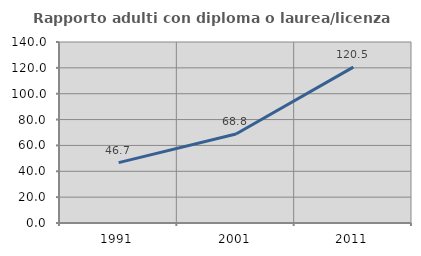
| Category | Rapporto adulti con diploma o laurea/licenza media  |
|---|---|
| 1991.0 | 46.667 |
| 2001.0 | 68.807 |
| 2011.0 | 120.536 |